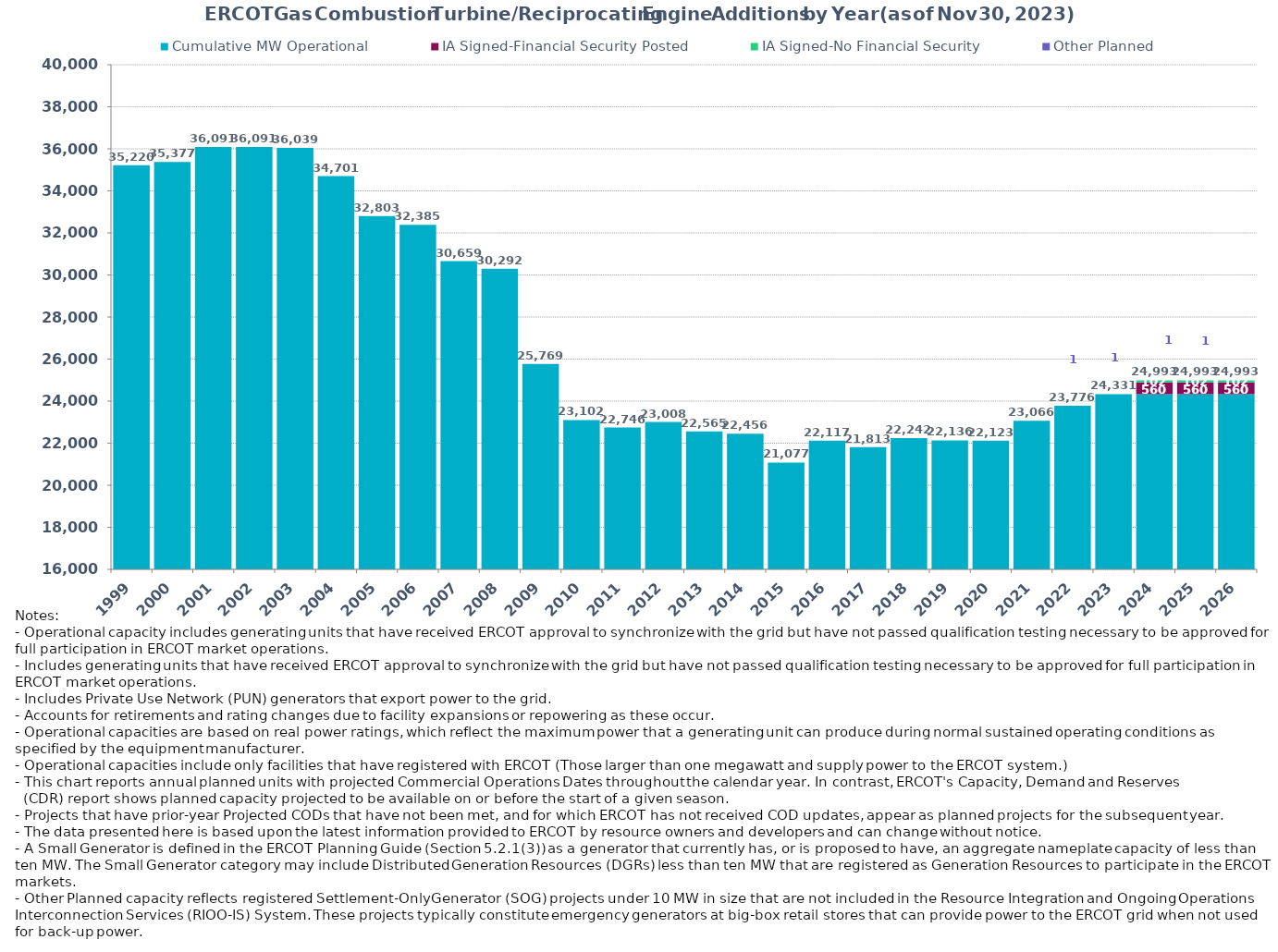
| Category | Cumulative MW Operational | IA Signed-Financial Security Posted | IA Signed-No Financial Security  | Other Planned | Cumulative Installed and Planned |
|---|---|---|---|---|---|
| 1999.0 | 35219.87 | 0 | 0 | 0 | 35219.87 |
| 2000.0 | 35377.48 | 0 | 0 | 0 | 35377.48 |
| 2001.0 | 36091.14 | 0 | 0 | 0 | 36091.14 |
| 2002.0 | 36091.14 | 0 | 0 | 0 | 36091.14 |
| 2003.0 | 36039.14 | 0 | 0 | 0 | 36039.14 |
| 2004.0 | 34701.24 | 0 | 0 | 0 | 34701.24 |
| 2005.0 | 32803.04 | 0 | 0 | 0 | 32803.04 |
| 2006.0 | 32385.14 | 0 | 0 | 0 | 32385.14 |
| 2007.0 | 30659.14 | 0 | 0 | 0 | 30659.14 |
| 2008.0 | 30291.94 | 0 | 0 | 0 | 30291.94 |
| 2009.0 | 25769.37 | 0 | 0 | 0 | 25769.37 |
| 2010.0 | 23102.25 | 0 | 0 | 0 | 23102.25 |
| 2011.0 | 22745.55 | 0 | 0 | 0 | 22745.55 |
| 2012.0 | 23007.75 | 0 | 0 | 0 | 23007.75 |
| 2013.0 | 22564.91 | 0 | 0 | 0 | 22564.91 |
| 2014.0 | 22455.91 | 0 | 0 | 0 | 22455.91 |
| 2015.0 | 21077.11 | 0 | 0 | 0 | 21077.11 |
| 2016.0 | 22117.49 | 0 | 0 | 0 | 22117.49 |
| 2017.0 | 21812.63 | 0 | 0 | 0 | 21812.63 |
| 2018.0 | 22241.79 | 0 | 0 | 0 | 22241.79 |
| 2019.0 | 22136.49 | 0 | 0 | 0 | 22136.49 |
| 2020.0 | 22123.49 | 0 | 0 | 0 | 22123.49 |
| 2021.0 | 23065.69 | 0 | 0 | 0 | 23065.69 |
| 2022.0 | 23775.84 | 0 | 0 | 0 | 23775.84 |
| 2023.0 | 24329.84 | 0 | 0 | 1.2 | 24331.04 |
| 2024.0 | 24329.84 | 560 | 102 | 1.2 | 24993.04 |
| 2025.0 | 24329.84 | 560 | 102 | 1.2 | 24993.04 |
| 2026.0 | 24329.84 | 560 | 102 | 1.2 | 24993.04 |